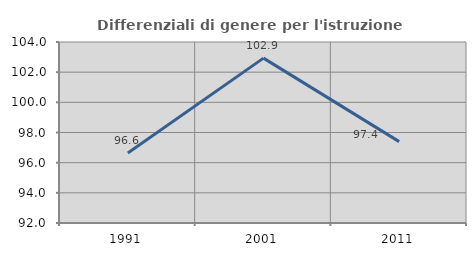
| Category | Differenziali di genere per l'istruzione superiore |
|---|---|
| 1991.0 | 96.644 |
| 2001.0 | 102.93 |
| 2011.0 | 97.394 |